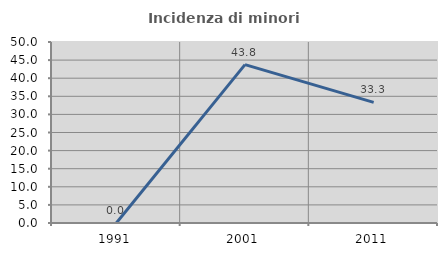
| Category | Incidenza di minori stranieri |
|---|---|
| 1991.0 | 0 |
| 2001.0 | 43.75 |
| 2011.0 | 33.333 |